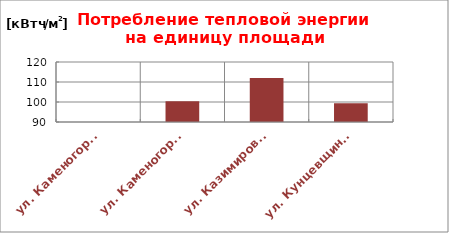
| Category | Series 0 |
|---|---|
| ул. Каменогорская, 30 | 0 |
| ул. Каменогорская, 86 | 100.37 |
| ул. Казимировская, 9 | 111.99 |
| ул. Кунцевщина, 35 | 99.379 |